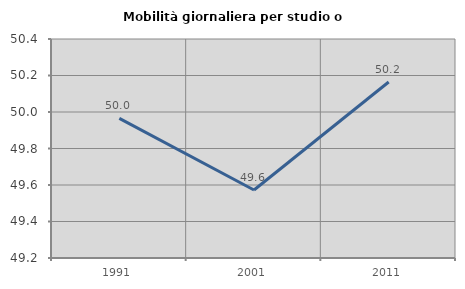
| Category | Mobilità giornaliera per studio o lavoro |
|---|---|
| 1991.0 | 49.965 |
| 2001.0 | 49.572 |
| 2011.0 | 50.164 |